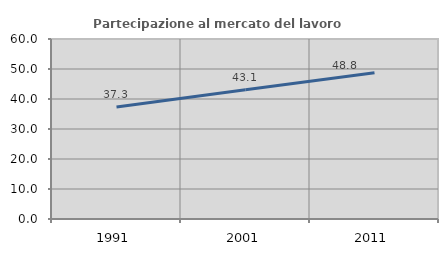
| Category | Partecipazione al mercato del lavoro  femminile |
|---|---|
| 1991.0 | 37.317 |
| 2001.0 | 43.06 |
| 2011.0 | 48.754 |